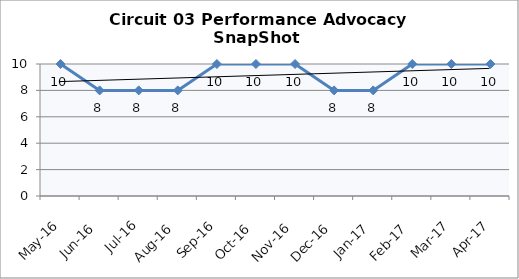
| Category | Circuit 03 |
|---|---|
| May-16 | 10 |
| Jun-16 | 8 |
| Jul-16 | 8 |
| Aug-16 | 8 |
| Sep-16 | 10 |
| Oct-16 | 10 |
| Nov-16 | 10 |
| Dec-16 | 8 |
| Jan-17 | 8 |
| Feb-17 | 10 |
| Mar-17 | 10 |
| Apr-17 | 10 |